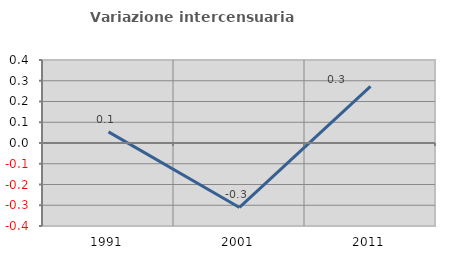
| Category | Variazione intercensuaria annua |
|---|---|
| 1991.0 | 0.054 |
| 2001.0 | -0.311 |
| 2011.0 | 0.273 |